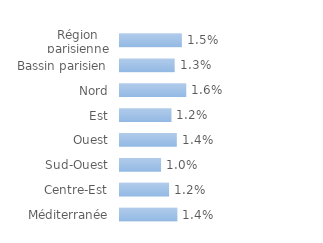
| Category | Series 0 |
|---|---|
| Région parisienne | 0.015 |
| Bassin parisien | 0.013 |
| Nord | 0.016 |
| Est | 0.012 |
| Ouest | 0.014 |
| Sud-Ouest | 0.01 |
| Centre-Est | 0.012 |
| Méditerranée | 0.014 |